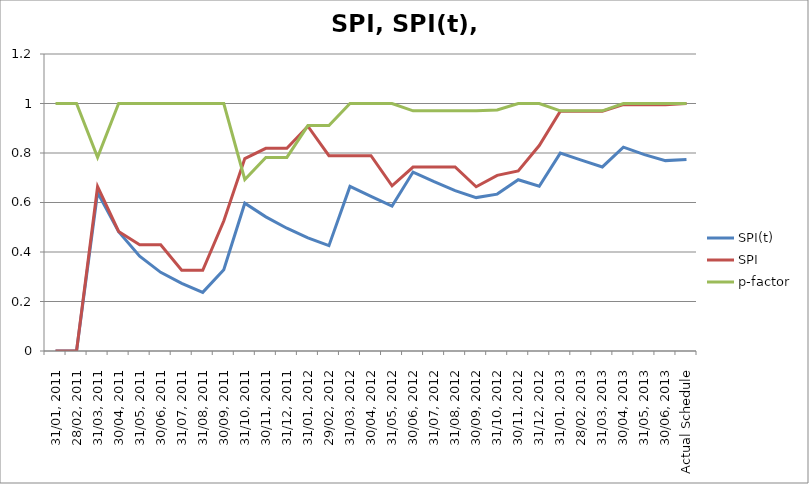
| Category | SPI(t) | SPI | p-factor |
|---|---|---|---|
| 31/01, 2011 | 0 | 0 | 1 |
| 28/02, 2011 | 0 | 0 | 1 |
| 31/03, 2011 | 0.641 | 0.665 | 0.783 |
| 30/04, 2011 | 0.482 | 0.483 | 1 |
| 31/05, 2011 | 0.383 | 0.429 | 1 |
| 30/06, 2011 | 0.318 | 0.429 | 1 |
| 31/07, 2011 | 0.273 | 0.326 | 1 |
| 31/08, 2011 | 0.237 | 0.326 | 1 |
| 30/09, 2011 | 0.328 | 0.525 | 1 |
| 31/10, 2011 | 0.597 | 0.777 | 0.693 |
| 30/11, 2011 | 0.542 | 0.819 | 0.782 |
| 31/12, 2011 | 0.496 | 0.819 | 0.782 |
| 31/01, 2012 | 0.457 | 0.908 | 0.911 |
| 29/02, 2012 | 0.426 | 0.789 | 0.911 |
| 31/03, 2012 | 0.665 | 0.789 | 1 |
| 30/04, 2012 | 0.625 | 0.789 | 1 |
| 31/05, 2012 | 0.586 | 0.667 | 1 |
| 30/06, 2012 | 0.723 | 0.743 | 0.97 |
| 31/07, 2012 | 0.684 | 0.743 | 0.97 |
| 31/08, 2012 | 0.648 | 0.743 | 0.97 |
| 30/09, 2012 | 0.62 | 0.664 | 0.97 |
| 31/10, 2012 | 0.634 | 0.71 | 0.974 |
| 30/11, 2012 | 0.692 | 0.727 | 1 |
| 31/12, 2012 | 0.666 | 0.83 | 1 |
| 31/01, 2013 | 0.8 | 0.969 | 0.97 |
| 28/02, 2013 | 0.771 | 0.969 | 0.97 |
| 31/03, 2013 | 0.744 | 0.969 | 0.97 |
| 30/04, 2013 | 0.824 | 0.995 | 1 |
| 31/05, 2013 | 0.794 | 0.995 | 1 |
| 30/06, 2013 | 0.769 | 0.995 | 1 |
| Actual Schedule | 0.774 | 1 | 1 |